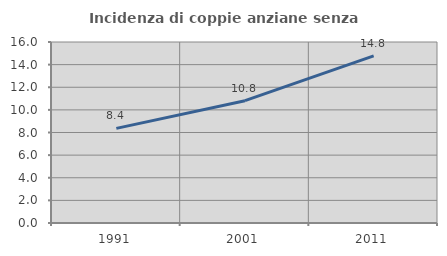
| Category | Incidenza di coppie anziane senza figli  |
|---|---|
| 1991.0 | 8.365 |
| 2001.0 | 10.811 |
| 2011.0 | 14.768 |